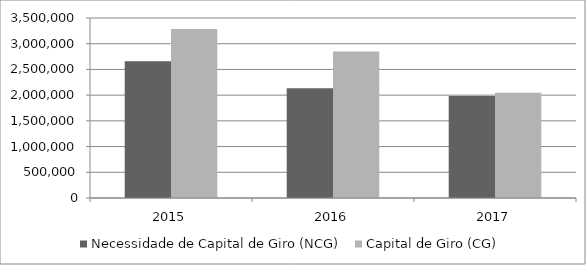
| Category | Necessidade de Capital de Giro (NCG) | Capital de Giro (CG) |
|---|---|---|
| 2015.0 | 2656960 | 3288398 |
| 2016.0 | 2135157 | 2847792 |
| 2017.0 | 1983965 | 2044249 |